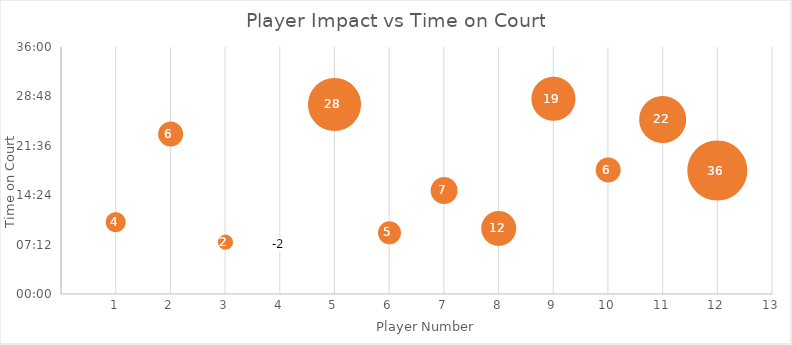
| Category | Series 0 |
|---|---|
| 0 | 0.007 |
| 1 | 0.016 |
| 2 | 0.005 |
| 3 | 0.005 |
| 4 | 0.019 |
| 5 | 0.006 |
| 6 | 0.01 |
| 7 | 0.007 |
| 8 | 0.02 |
| 9 | 0.013 |
| 10 | 0.018 |
| 11 | 0.012 |